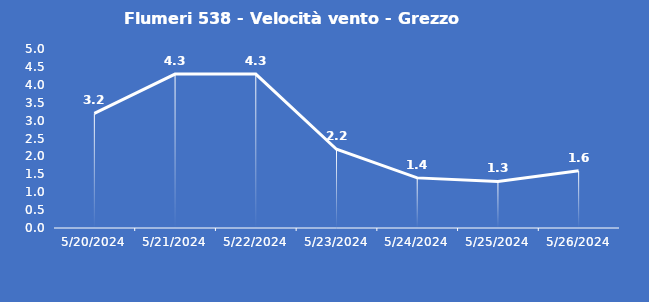
| Category | Flumeri 538 - Velocità vento - Grezzo (m/s) |
|---|---|
| 5/20/24 | 3.2 |
| 5/21/24 | 4.3 |
| 5/22/24 | 4.3 |
| 5/23/24 | 2.2 |
| 5/24/24 | 1.4 |
| 5/25/24 | 1.3 |
| 5/26/24 | 1.6 |